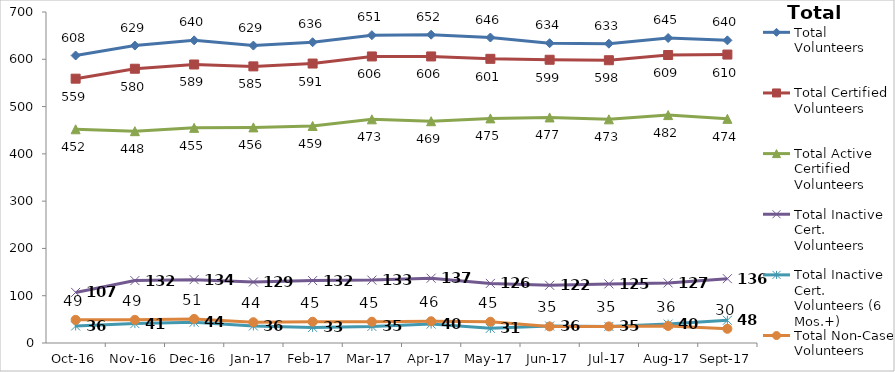
| Category | Total Volunteers | Total Certified Volunteers | Total Active Certified Volunteers | Total Inactive Cert. Volunteers | Total Inactive Cert. Volunteers (6 Mos.+) | Total Non-Case Volunteers |
|---|---|---|---|---|---|---|
| 2016-10-01 | 608 | 559 | 452 | 107 | 36 | 49 |
| 2016-11-01 | 629 | 580 | 448 | 132 | 41 | 49 |
| 2016-12-01 | 640 | 589 | 455 | 134 | 44 | 51 |
| 2017-01-01 | 629 | 585 | 456 | 129 | 36 | 44 |
| 2017-02-01 | 636 | 591 | 459 | 132 | 33 | 45 |
| 2017-03-01 | 651 | 606 | 473 | 133 | 35 | 45 |
| 2017-04-01 | 652 | 606 | 469 | 137 | 40 | 46 |
| 2017-05-01 | 646 | 601 | 475 | 126 | 31 | 45 |
| 2017-06-01 | 634 | 599 | 477 | 122 | 36 | 35 |
| 2017-07-01 | 633 | 598 | 473 | 125 | 35 | 35 |
| 2017-08-01 | 645 | 609 | 482 | 127 | 40 | 36 |
| 2017-09-01 | 640 | 610 | 474 | 136 | 48 | 30 |